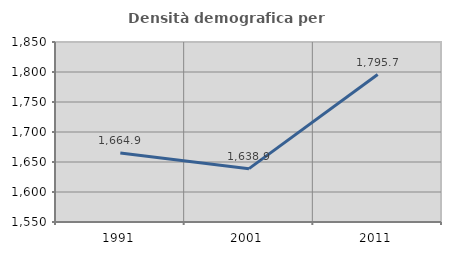
| Category | Densità demografica |
|---|---|
| 1991.0 | 1664.873 |
| 2001.0 | 1638.935 |
| 2011.0 | 1795.696 |